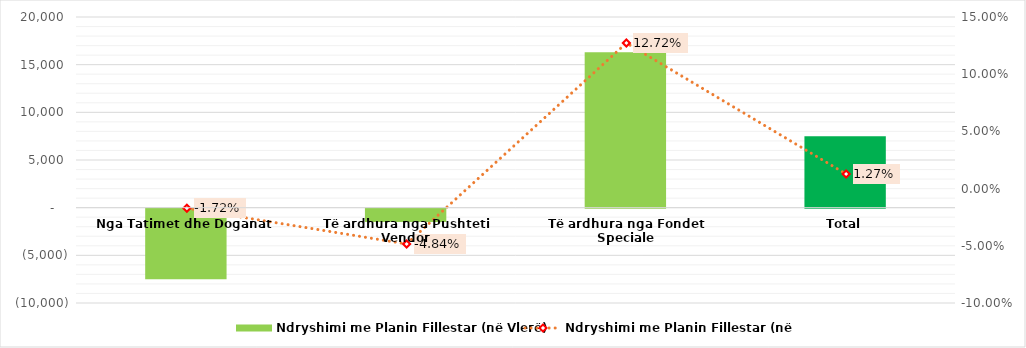
| Category | Ndryshimi me Planin Fillestar (në Vlerë) |
|---|---|
| Nga Tatimet dhe Doganat | -7400 |
| Të ardhura nga Pushteti Vendor | -1411 |
| Të ardhura nga Fondet Speciale | 16300 |
| Total | 7489 |